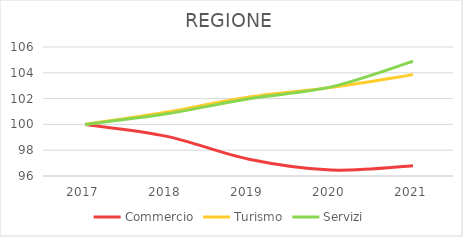
| Category | Commercio | Turismo | Servizi |
|---|---|---|---|
| 2017.0 | 100 | 100 | 100 |
| 2018.0 | 99.07 | 100.954 | 100.822 |
| 2019.0 | 97.297 | 102.129 | 101.994 |
| 2020.0 | 96.46 | 102.87 | 102.909 |
| 2021.0 | 96.785 | 103.86 | 104.892 |